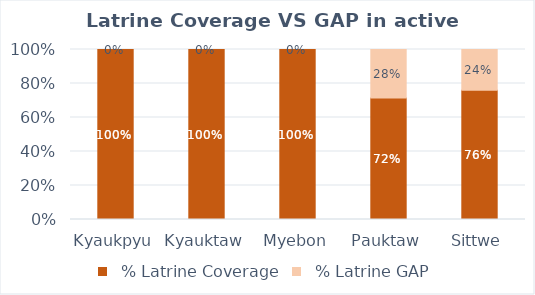
| Category |   % Latrine Coverage |   % Latrine GAP |
|---|---|---|
| Kyaukpyu | 1 | 0 |
| Kyauktaw | 1 | 0 |
| Myebon | 1 | 0 |
| Pauktaw | 0.715 | 0.285 |
| Sittwe | 0.76 | 0.24 |